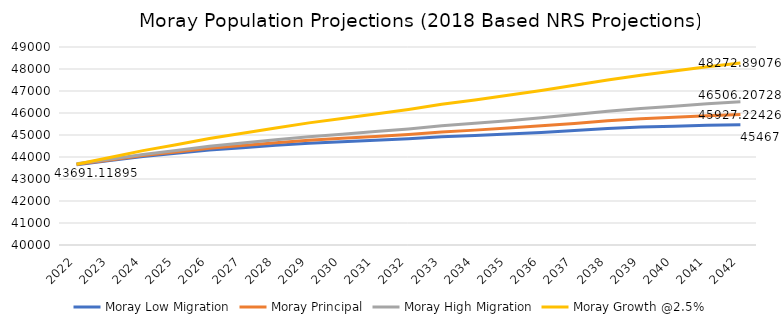
| Category | Moray Low Migration | Moray Principal | Moray High Migration | Moray Growth @2.5% |
|---|---|---|---|---|
| 2022 | 43651 | 43669.415 | 43691.119 | 43669.415 |
| 2023 | 43838 | 43867.908 | 43898.301 | 43977.082 |
| 2024 | 44026 | 44070.502 | 44112.423 | 44290.123 |
| 2025 | 44168 | 44228.302 | 44292.57 | 44559.434 |
| 2026 | 44319 | 44397.992 | 44486.722 | 44841.793 |
| 2027 | 44420 | 44519.752 | 44631.487 | 45076.875 |
| 2028 | 44529 | 44648.676 | 44783.369 | 45320.105 |
| 2029 | 44625 | 44764.834 | 44922.849 | 45551.309 |
| 2030 | 44689 | 44848.265 | 45034.532 | 45750.084 |
| 2031 | 44760 | 44936.396 | 45155.838 | 45954.363 |
| 2032 | 44831 | 45027.541 | 45277.146 | 46162.459 |
| 2033 | 44925 | 45140.577 | 45419.927 | 46393.749 |
| 2034 | 44978 | 45221.5 | 45529.57 | 46592.904 |
| 2035 | 45042 | 45313.385 | 45647.136 | 46804.058 |
| 2036 | 45119 | 45415.184 | 45782.347 | 47026.216 |
| 2037 | 45204 | 45527.187 | 45930.128 | 47259.757 |
| 2038 | 45294 | 45644.652 | 46079.598 | 47499.842 |
| 2039 | 45361 | 45740.356 | 46207.46 | 47718.185 |
| 2040 | 45403 | 45810.234 | 46311.735 | 47910.38 |
| 2041 | 45447 | 45880.012 | 46418.612 | 48103.133 |
| 2042 | 45467 | 45927.224 | 46506.207 | 48272.891 |